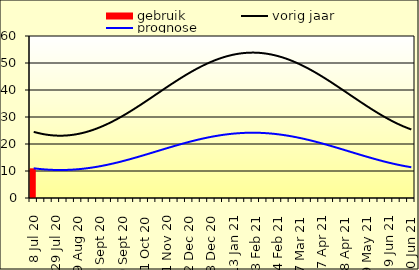
| Category | gebruik |
|---|---|
| 2020-07-08 | 11 |
| 2020-07-15 | 0 |
| 2020-07-22 | 0 |
| 2020-07-29 | 0 |
| 2020-08-05 | 0 |
| 2020-08-12 | 0 |
| 2020-08-19 | 0 |
| 2020-08-26 | 0 |
| 2020-09-02 | 0 |
| 2020-09-09 | 0 |
| 2020-09-16 | 0 |
| 2020-09-23 | 0 |
| 2020-09-30 | 0 |
| 2020-10-07 | 0 |
| 2020-10-14 | 0 |
| 2020-10-21 | 0 |
| 2020-10-28 | 0 |
| 2020-11-04 | 0 |
| 2020-11-11 | 0 |
| 2020-11-18 | 0 |
| 2020-11-25 | 0 |
| 2020-12-02 | 0 |
| 2020-12-09 | 0 |
| 2020-12-16 | 0 |
| 2020-12-23 | 0 |
| 2020-12-30 | 0 |
| 2021-01-06 | 0 |
| 2021-01-13 | 0 |
| 2021-01-20 | 0 |
| 2021-01-27 | 0 |
| 2021-02-03 | 0 |
| 2021-02-10 | 0 |
| 2021-02-17 | 0 |
| 2021-02-24 | 0 |
| 2021-03-03 | 0 |
| 2021-03-10 | 0 |
| 2021-03-17 | 0 |
| 2021-03-24 | 0 |
| 2021-03-31 | 0 |
| 2021-04-07 | 0 |
| 2021-04-14 | 0 |
| 2021-04-21 | 0 |
| 2021-04-28 | 0 |
| 2021-05-05 | 0 |
| 2021-05-12 | 0 |
| 2021-05-19 | 0 |
| 2021-05-26 | 0 |
| 2021-06-02 | 0 |
| 2021-06-09 | 0 |
| 2021-06-16 | 0 |
| 2021-06-23 | 0 |
| 2021-06-30 | 0 |